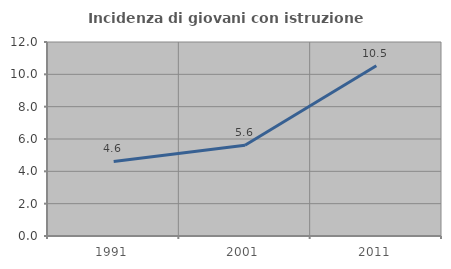
| Category | Incidenza di giovani con istruzione universitaria |
|---|---|
| 1991.0 | 4.612 |
| 2001.0 | 5.616 |
| 2011.0 | 10.536 |